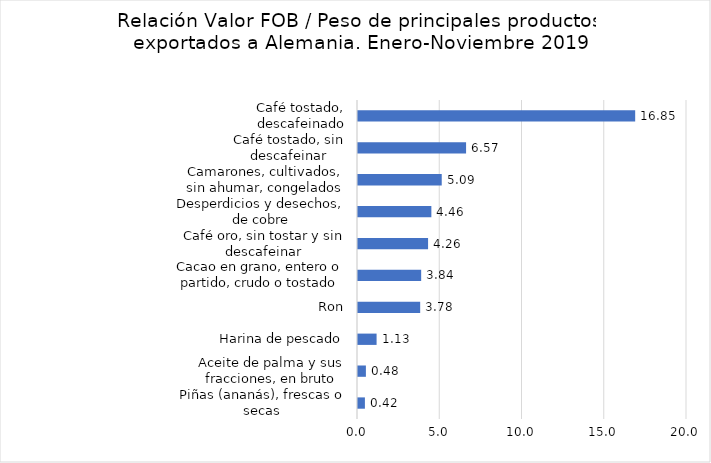
| Category | Series 0 |
|---|---|
| Piñas (ananás), frescas o secas | 0.42 |
| Aceite de palma y sus fracciones, en bruto | 0.48 |
| Harina de pescado | 1.13 |
| Ron | 3.78 |
| Cacao en grano, entero o partido, crudo o tostado | 3.84 |
| Café oro, sin tostar y sin descafeinar | 4.26 |
| Desperdicios y desechos, de cobre | 4.46 |
| Camarones, cultivados, sin ahumar, congelados | 5.09 |
| Café tostado, sin descafeinar | 6.57 |
| Café tostado, descafeinado | 16.85 |